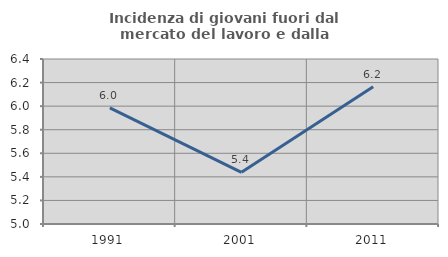
| Category | Incidenza di giovani fuori dal mercato del lavoro e dalla formazione  |
|---|---|
| 1991.0 | 5.986 |
| 2001.0 | 5.438 |
| 2011.0 | 6.165 |